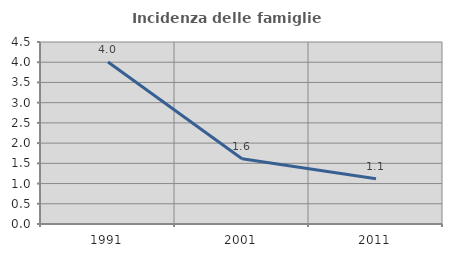
| Category | Incidenza delle famiglie numerose |
|---|---|
| 1991.0 | 4.003 |
| 2001.0 | 1.615 |
| 2011.0 | 1.121 |